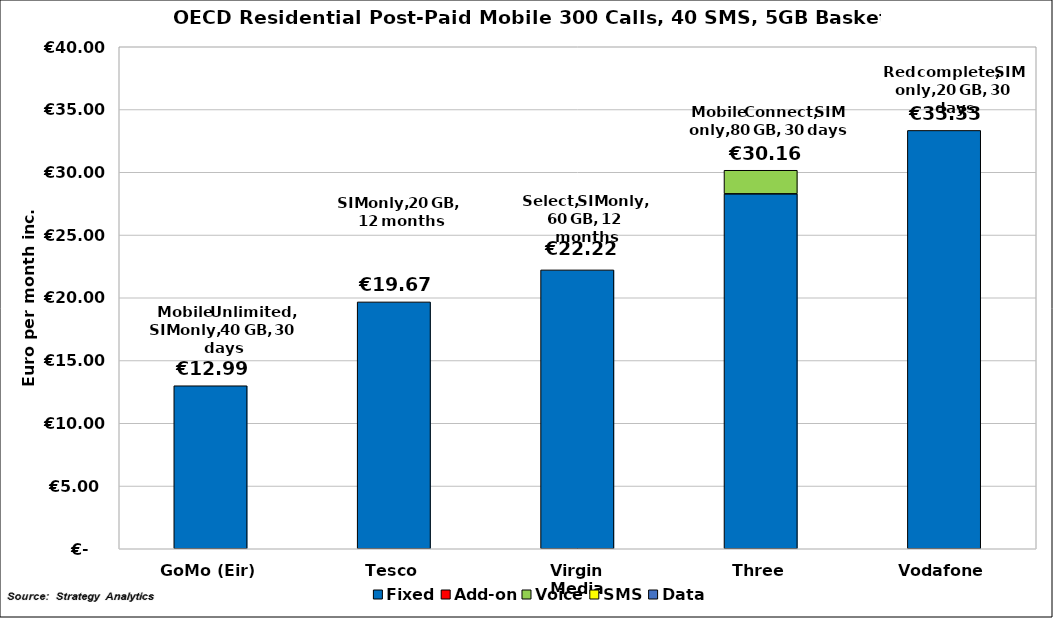
| Category | Fixed | Add-on | Voice | SMS | Data |
|---|---|---|---|---|---|
| 0 | 12.99 | 0 | 0 | 0 | 0 |
| 1 | 19.67 | 0 | 0 | 0 | 0 |
| 2 | 22.22 | 0 | 0 | 0 | 0 |
| 3 | 28.28 | 0 | 1.88 | 0 | 0 |
| 4 | 33.333 | 0 | 0 | 0 | 0 |